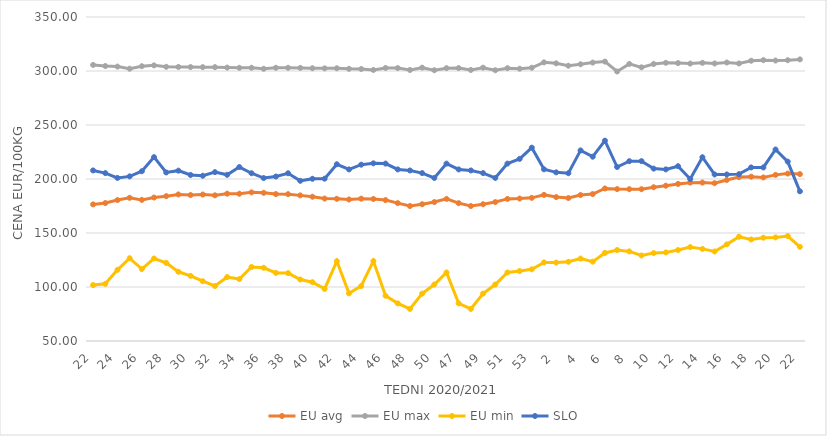
| Category | EU avg | EU max | EU min | SLO |
|---|---|---|---|---|
| 22.0 | 176.473 | 305.64 | 101.792 | 207.91 |
| 23.0 | 177.741 | 304.59 | 102.918 | 205.46 |
| 24.0 | 180.501 | 304.1 | 115.936 | 201 |
| 25.0 | 182.568 | 302.13 | 126.655 | 202.43 |
| 26.0 | 180.667 | 304.43 | 116.597 | 207.19 |
| 27.0 | 182.833 | 305.22 | 126.397 | 220.25 |
| 28.0 | 184.121 | 303.88 | 122.317 | 206.06 |
| 29.0 | 185.712 | 303.73 | 114.082 | 207.73 |
| 30.0 | 185.141 | 303.63 | 110.314 | 203.73 |
| 31.0 | 185.621 | 303.57 | 105.336 | 203 |
| 32.0 | 184.887 | 303.58 | 100.908 | 206.36 |
| 33.0 | 186.411 | 303.17 | 109.191 | 203.88 |
| 34.0 | 186.338 | 302.96 | 107.355 | 211.07 |
| 35.0 | 187.628 | 302.99 | 118.534 | 205.34 |
| 36.0 | 187.19 | 302.05 | 117.814 | 200.88 |
| 37.0 | 186.038 | 302.98 | 113.058 | 202.29 |
| 38.0 | 185.986 | 302.94 | 112.896 | 205.33 |
| 39.0 | 184.836 | 302.88 | 106.953 | 198.33 |
| 40.0 | 183.595 | 302.56 | 104.426 | 200.21 |
| 41.0 | 181.893 | 302.44 | 98.23 | 200.3 |
| 42.0 | 181.671 | 302.52 | 123.908 | 213.66 |
| 43.0 | 181.023 | 302.01 | 94.177 | 208.86 |
| 44.0 | 181.795 | 301.86 | 100.908 | 213.25 |
| 45.0 | 181.489 | 300.98 | 124 | 214.51 |
| 46.0 | 180.473 | 302.82 | 91.889 | 214.27 |
| 47.0 | 177.656 | 302.7 | 84.832 | 208.87 |
| 48.0 | 174.977 | 300.94 | 79.697 | 207.9 |
| 49.0 | 176.65 | 303.09 | 93.873 | 205.48 |
| 50.0 | 178.648 | 300.7 | 102.316 | 200.99 |
| 51.0 | 181.58 | 302.62 | 113.46 | 214.25 |
| 47.0 | 177.656 | 302.7 | 84.832 | 208.87 |
| 48.0 | 174.977 | 300.94 | 79.697 | 207.9 |
| 49.0 | 176.65 | 303.09 | 93.873 | 205.48 |
| 50.0 | 178.648 | 300.7 | 102.316 | 200.99 |
| 51.0 | 181.58 | 302.62 | 113.46 | 214.25 |
| 52.0 | 181.9 | 302.14 | 114.76 | 218.61 |
| 53.0 | 182.536 | 303 | 116.375 | 229 |
| 1.0 | 185.3 | 308 | 122.769 | 209 |
| 2.0 | 183.25 | 307.1 | 122.609 | 206.15 |
| 3.0 | 182.393 | 304.91 | 123.32 | 205.35 |
| 4.0 | 185.158 | 306.22 | 126.329 | 226.48 |
| 5.0 | 186.04 | 307.79 | 123.461 | 220.65 |
| 6.0 | 191.206 | 308.7 | 131.528 | 235.46 |
| 7.0 | 190.629 | 299.55 | 134.262 | 211.1 |
| 8.0 | 190.57 | 306.55 | 132.97 | 216.51 |
| 9.0 | 190.562 | 303.4 | 129.173 | 216.54 |
| 10.0 | 192.373 | 306.48 | 131.374 | 209.61 |
| 11.0 | 193.79 | 307.58 | 132.024 | 208.91 |
| 12.0 | 195.449 | 307.33 | 134.212 | 211.87 |
| 13.0 | 196.631 | 306.85 | 136.936 | 199.93 |
| 14.0 | 196.702 | 307.56 | 135.297 | 220.15 |
| 15.0 | 196.13 | 306.96 | 132.893 | 204.2 |
| 16.0 | 199.1 | 307.87 | 139.462 | 204.2 |
| 17.0 | 201.754 | 306.98 | 146.538 | 204.51 |
| 18.0 | 202.13 | 309.49 | 144.017 | 210.72 |
| 19.0 | 201.439 | 310.06 | 145.644 | 210.68 |
| 20.0 | 203.834 | 309.69 | 145.911 | 227.32 |
| 21.0 | 205.04 | 309.99 | 147.188 | 216.08 |
| 22.0 | 204.537 | 310.76 | 137.177 | 188.6 |